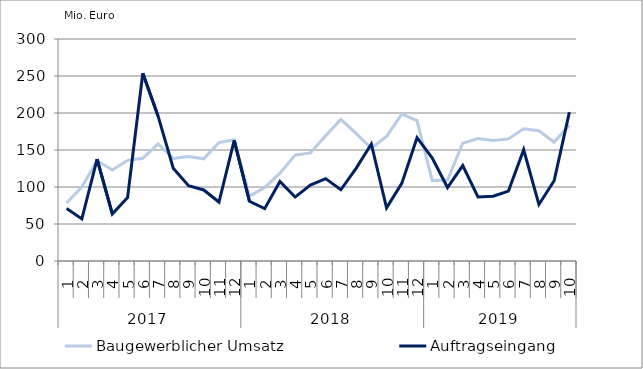
| Category | Baugewerblicher Umsatz | Auftragseingang |
|---|---|---|
| 0 | 78446.78 | 70908.903 |
| 1 | 99841.908 | 56868.408 |
| 2 | 135679.867 | 137790.423 |
| 3 | 123004.403 | 63637.761 |
| 4 | 136010.071 | 85644.63 |
| 5 | 138859.308 | 253791.552 |
| 6 | 158353.879 | 196034.198 |
| 7 | 138510.315 | 125319.873 |
| 8 | 141109.925 | 101690.626 |
| 9 | 138067.098 | 95966.626 |
| 10 | 160064.454 | 79701.993 |
| 11 | 163969.017 | 162878.607 |
| 12 | 87640.529 | 80684.627 |
| 13 | 99259.455 | 70746.763 |
| 14 | 118764.324 | 107538.747 |
| 15 | 143144.178 | 86374.619 |
| 16 | 146070.782 | 102661.329 |
| 17 | 169150.753 | 111287.709 |
| 18 | 191277.885 | 96286.662 |
| 19 | 172425.535 | 125142.495 |
| 20 | 152354.98 | 158112.302 |
| 21 | 168372.756 | 71808.619 |
| 22 | 198558.472 | 104904.147 |
| 23 | 189665.914 | 166653.461 |
| 24 | 108616.605 | 139065.287 |
| 25 | 109331.58 | 99318.609 |
| 26 | 159117.81 | 129002.041 |
| 27 | 165654.287 | 86579.2 |
| 28 | 162976.056 | 87644.362 |
| 29 | 165026.188 | 94463.186 |
| 30 | 178622.938 | 150345.08 |
| 31 | 176074.101 | 76434.317 |
| 32 | 160663.041 | 108444.162 |
| 33 | 183589.485 | 201122.697 |